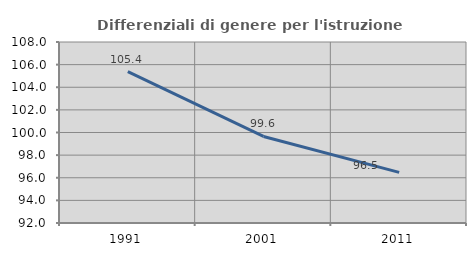
| Category | Differenziali di genere per l'istruzione superiore |
|---|---|
| 1991.0 | 105.384 |
| 2001.0 | 99.649 |
| 2011.0 | 96.474 |